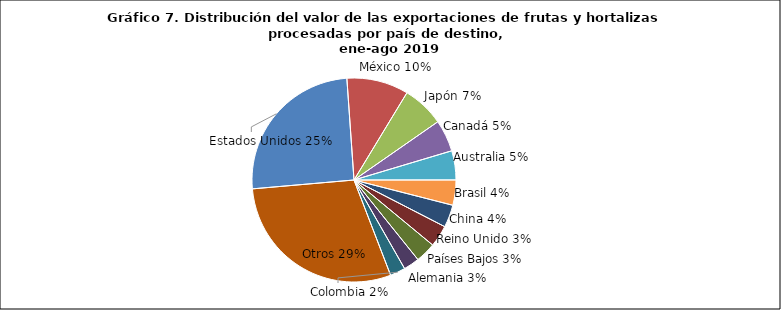
| Category | Series 0 |
|---|---|
| Estados Unidos | 252635882.72 |
| México | 97963543.43 |
| Japón | 66466575.57 |
| Canadá | 50446556.66 |
| Australia | 46086404.46 |
| Brasil | 39938067.99 |
| China | 35715380.06 |
| Reino Unido | 34316232.57 |
| Países Bajos | 32365773.17 |
| Alemania | 25097488.7 |
| Colombia | 24157575.28 |
| Otros | 294423812.06 |